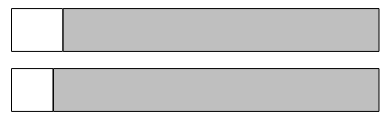
| Category | Series 0 | Series 1 |
|---|---|---|
| 0 | 154419 | 1199415 |
| 1 | 219998 | 1347278 |